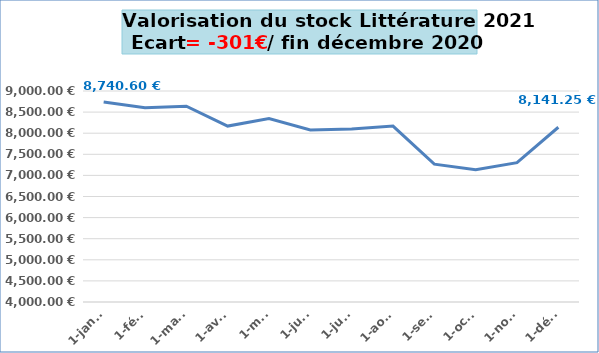
| Category | Series 0 |
|---|---|
| 2021-01-01 | 8740.6 |
| 2021-02-01 | 8604.6 |
| 2021-03-01 | 8639.6 |
| 2021-04-01 | 8168.6 |
| 2021-05-01 | 8349.1 |
| 2021-06-01 | 8078.6 |
| 2021-07-01 | 8101 |
| 2021-08-01 | 8169.9 |
| 2021-09-01 | 7266.9 |
| 2021-10-01 | 7135.75 |
| 2021-11-01 | 7302.15 |
| 2021-12-01 | 8141.25 |